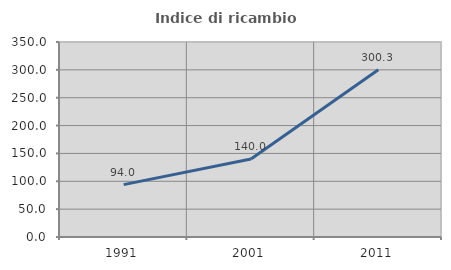
| Category | Indice di ricambio occupazionale  |
|---|---|
| 1991.0 | 94.003 |
| 2001.0 | 140.031 |
| 2011.0 | 300.314 |